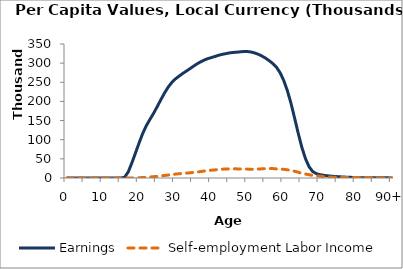
| Category | Earnings | Self-employment Labor Income |
|---|---|---|
| 0 | 0 | 0 |
|  | 0 | 0 |
| 2 | 0 | 0 |
| 3 | 0 | 0 |
| 4 | 0 | 0 |
| 5 | 0 | 0 |
| 6 | 0 | 0 |
| 7 | 0 | 0 |
| 8 | 0 | 0 |
| 9 | 0 | 0 |
| 10 | 0 | 0 |
| 11 | 0 | 0 |
| 12 | 0 | 0 |
| 13 | 0 | 0 |
| 14 | 0 | 0 |
| 15 | 0 | 0 |
| 16 | 2095.988 | 6.247 |
| 17 | 16031.089 | 80.699 |
| 18 | 39461.423 | 208.434 |
| 19 | 65559.586 | 428.709 |
| 20 | 91756.646 | 752.849 |
| 21 | 116416.47 | 1267.88 |
| 22 | 136864.646 | 1923.655 |
| 23 | 153205.875 | 2626.905 |
| 24 | 168943.053 | 3401.521 |
| 25 | 186201.689 | 4241.942 |
| 26 | 204320.07 | 5300.667 |
| 27 | 221510.799 | 6556.288 |
| 28 | 236803.297 | 7746.585 |
| 29 | 249148.458 | 8871.763 |
| 30 | 258423.632 | 10068.099 |
| 31 | 265744.784 | 11129.486 |
| 32 | 272550.058 | 11938.631 |
| 33 | 278925.011 | 12682.781 |
| 34 | 285203.19 | 13490.355 |
| 35 | 291681.946 | 14495.711 |
| 36 | 297937.839 | 15594.702 |
| 37 | 303328.601 | 16774.825 |
| 38 | 308070.216 | 18123.828 |
| 39 | 311810.589 | 19460.472 |
| 40 | 314560.938 | 20426.356 |
| 41 | 317534.45 | 21168.402 |
| 42 | 320660.976 | 22156.817 |
| 43 | 322959.315 | 23050.06 |
| 44 | 324879.983 | 23470.586 |
| 45 | 326788.983 | 23739.698 |
| 46 | 327936.059 | 24045.097 |
| 47 | 328580.719 | 23812.017 |
| 48 | 329584.354 | 23516.318 |
| 49 | 330347.625 | 23501.934 |
| 50 | 330245.317 | 23169.02 |
| 51 | 329046.041 | 22669.506 |
| 52 | 326546.525 | 22839.247 |
| 53 | 322961.858 | 23556.59 |
| 54 | 318412.444 | 23981.197 |
| 55 | 312842.194 | 24391.914 |
| 56 | 306269.656 | 24858.986 |
| 57 | 298762.734 | 24614.847 |
| 58 | 289245.252 | 23734.905 |
| 59 | 274987.5 | 23138.93 |
| 60 | 254682.361 | 22651.589 |
| 61 | 228241.736 | 21415.192 |
| 62 | 195414.042 | 19715.531 |
| 63 | 156969.881 | 17666.683 |
| 64 | 117044.916 | 15086.998 |
| 65 | 80567.835 | 12328.161 |
| 66 | 50873.966 | 10222.955 |
| 67 | 29552.672 | 8559.657 |
| 68 | 17009.492 | 6943.956 |
| 69 | 11345.106 | 5688.248 |
| 70 | 8756.008 | 4700.555 |
| 71 | 7068.975 | 3659.473 |
| 72 | 5810.95 | 2796.51 |
| 73 | 4846.569 | 2313.179 |
| 74 | 4075.059 | 2018.376 |
| 75 | 3427.81 | 1759.269 |
| 76 | 2838.285 | 1527.021 |
| 77 | 2321.629 | 1454.137 |
| 78 | 1916.334 | 1537.159 |
| 79 | 1532.659 | 1487.762 |
| 80 | 1167.869 | 1384.515 |
| 81 | 892.999 | 1337.375 |
| 82 | 794.971 | 1212.172 |
| 83 | 754.553 | 1057.863 |
| 84 | 698.462 | 1037.992 |
| 85 | 673.257 | 969.247 |
| 86 | 633.221 | 836.905 |
| 87 | 513.93 | 797.326 |
| 88 | 415.627 | 746.45 |
| 89 | 347.718 | 647.129 |
| 90+ | 135.165 | 207.845 |